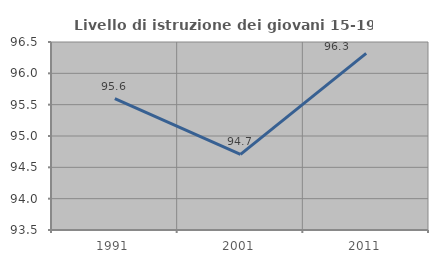
| Category | Livello di istruzione dei giovani 15-19 anni |
|---|---|
| 1991.0 | 95.595 |
| 2001.0 | 94.706 |
| 2011.0 | 96.319 |